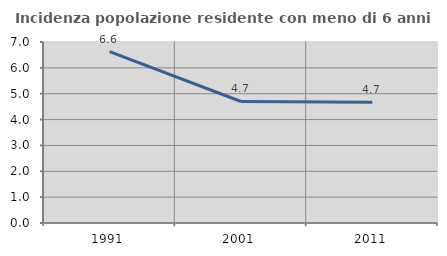
| Category | Incidenza popolazione residente con meno di 6 anni |
|---|---|
| 1991.0 | 6.627 |
| 2001.0 | 4.699 |
| 2011.0 | 4.67 |